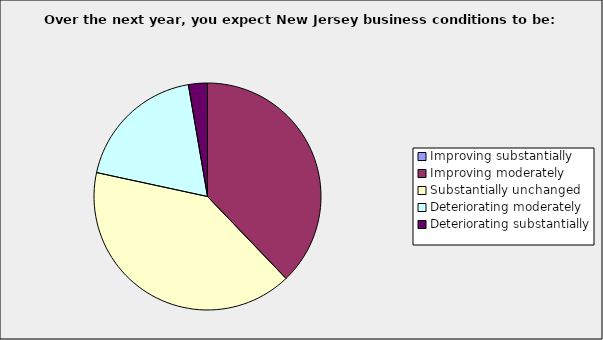
| Category | Series 0 |
|---|---|
| Improving substantially | 0 |
| Improving moderately | 0.378 |
| Substantially unchanged | 0.405 |
| Deteriorating moderately | 0.189 |
| Deteriorating substantially | 0.027 |